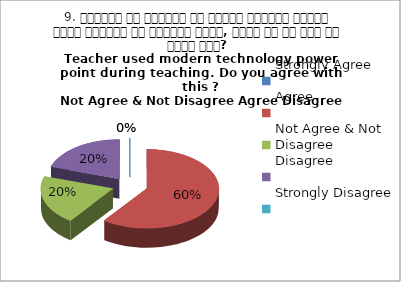
| Category | 9. शिक्षक ने शिक्षण के दौरान आधुनिक तकनीक पावर पॉइन्ट का प्रयोग किया, क्या आप इस बात से सहमत हैं? 
Teacher used modern technology power point during teaching. Do you agree with this ?
 Not Agree & Not Disagree Agree Disagree Agree Agree |
|---|---|
| Strongly Agree | 0 |
| Agree | 3 |
| Not Agree & Not Disagree | 1 |
| Disagree | 1 |
| Strongly Disagree | 0 |